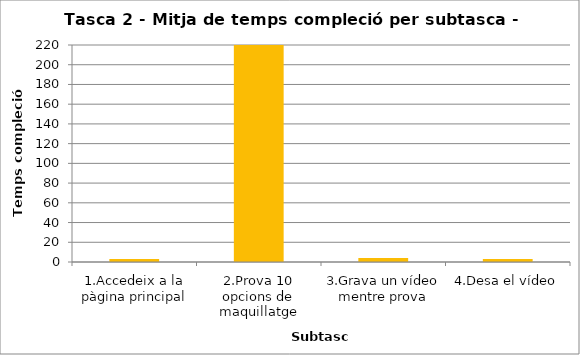
| Category | Series 0 |
|---|---|
| 1.Accedeix a la pàgina principal | 3 |
| 2.Prova 10 opcions de maquillatge | 220 |
| 3.Grava un vídeo mentre prova | 4 |
| 4.Desa el vídeo | 3 |